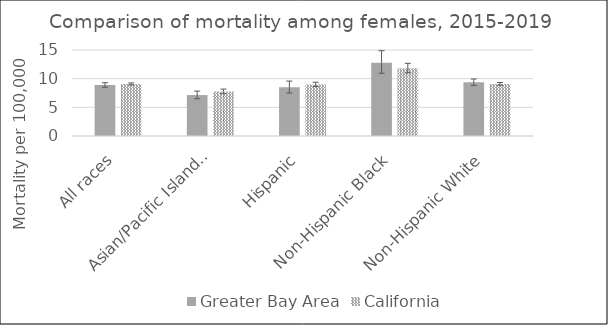
| Category | Greater Bay Area | California | US Mortality |
|---|---|---|---|
| All races | 8.9 | 9.08 |  |
| Asian/Pacific Islander | 7.14 | 7.77 |  |
| Hispanic | 8.49 | 9 |  |
| Non-Hispanic Black | 12.79 | 11.82 |  |
| Non-Hispanic White | 9.37 | 9.09 |  |